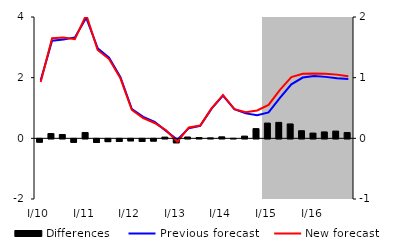
| Category | Differences |
|---|---|
| I/10 | -0.055 |
| II | 0.079 |
| III | 0.064 |
| IV | -0.057 |
| I/11 | 0.097 |
| II | -0.06 |
| III | -0.046 |
| IV | -0.043 |
| I/12 | -0.033 |
| II | -0.043 |
| III | -0.037 |
| IV | 0.02 |
| I/13 | -0.065 |
| II | 0.022 |
| III | 0.013 |
| IV | 0.008 |
| I/14 | 0.025 |
| II | 0.001 |
| III | 0.037 |
| IV | 0.16 |
| I/15 | 0.251 |
| II | 0.263 |
| III | 0.237 |
| IV | 0.125 |
| I/16 | 0.087 |
| II | 0.106 |
| III | 0.119 |
| IV | 0.096 |